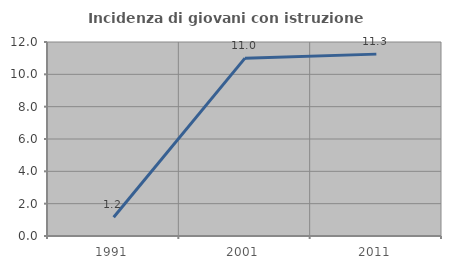
| Category | Incidenza di giovani con istruzione universitaria |
|---|---|
| 1991.0 | 1.163 |
| 2001.0 | 11 |
| 2011.0 | 11.25 |